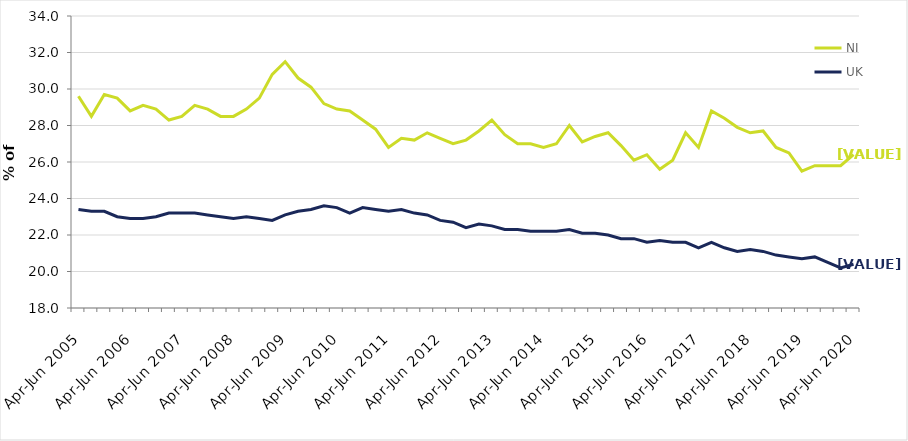
| Category | NI | UK |
|---|---|---|
| Apr-Jun 2005 | 29.6 | 23.4 |
| Jul-Sep 2005 | 28.5 | 23.3 |
| Oct-Dec 2005 | 29.7 | 23.3 |
| Jan-Mar 2006 | 29.5 | 23 |
| Apr-Jun 2006 | 28.8 | 22.9 |
| Jul-Sep 2006 | 29.1 | 22.9 |
| Oct-Dec 2006 | 28.9 | 23 |
| Jan-Mar 2007 | 28.3 | 23.2 |
| Apr-Jun 2007 | 28.5 | 23.2 |
| Jul-Sep 2007 | 29.1 | 23.2 |
| Oct-Dec 2007 | 28.9 | 23.1 |
| Jan-Mar 2008 | 28.5 | 23 |
| Apr-Jun 2008 | 28.5 | 22.9 |
| Jul-Sep 2008 | 28.9 | 23 |
| Oct-Dec 2008 | 29.5 | 22.9 |
| Jan-Mar 2009 | 30.8 | 22.8 |
| Apr-Jun 2009 | 31.5 | 23.1 |
| Jul-Sep 2009 | 30.6 | 23.3 |
| Oct-Dec 2009 | 30.1 | 23.4 |
| Jan-Mar 2010 | 29.2 | 23.6 |
| Apr-Jun 2010 | 28.9 | 23.5 |
| Jul-Sep 2010 | 28.8 | 23.2 |
| Oct-Dec 2010 | 28.3 | 23.5 |
| Jan-Mar 2011 | 27.8 | 23.4 |
| Apr-Jun 2011 | 26.8 | 23.3 |
| Jul-Sep 2011 | 27.3 | 23.4 |
| Oct-Dec 2011 | 27.2 | 23.2 |
| Jan-Mar 2012 | 27.6 | 23.1 |
| Apr-Jun 2012 | 27.3 | 22.8 |
| Jul-Sep 2012 | 27 | 22.7 |
| Oct-Dec 2012 | 27.2 | 22.4 |
| Jan-Mar 2013 | 27.7 | 22.6 |
| Apr-Jun 2013 | 28.3 | 22.5 |
| Jul-Sep 2013 | 27.5 | 22.3 |
| Oct-Dec 2013 | 27 | 22.3 |
| Jan-Mar 2014 | 27 | 22.2 |
| Apr-Jun 2014 | 26.8 | 22.2 |
| Jul-Sep 2014 | 27 | 22.2 |
| Oct-Dec 2014 | 28 | 22.3 |
| Jan-Mar 2015 | 27.1 | 22.1 |
| Apr-Jun 2015 | 27.4 | 22.1 |
| Jul-Sep 2015 | 27.6 | 22 |
| Oct-Dec 2015 | 26.9 | 21.8 |
| Jan-Mar 2016 | 26.1 | 21.8 |
| Apr-Jun 2016 | 26.4 | 21.6 |
| Jul-Sep 2016 | 25.6 | 21.7 |
| Oct-Dec 2016 | 26.1 | 21.6 |
| Jan-Mar 2017 | 27.6 | 21.6 |
| Apr-Jun 2017 | 26.8 | 21.3 |
| Jul-Sep 2017 | 28.8 | 21.6 |
| Oct-Dec 2017 | 28.4 | 21.3 |
| Jan-Mar 2018 | 27.9 | 21.1 |
| Apr-Jun 2018 | 27.6 | 21.2 |
| Jul-Sep 2018 | 27.7 | 21.1 |
| Oct-Dec 2018 | 26.8 | 20.9 |
| Jan-Mar 2019 | 26.5 | 20.8 |
| Apr-Jun 2019 | 25.5 | 20.7 |
| Jul-Sep 2019 | 25.8 | 20.8 |
| Oct-Dec 2019 | 25.8 | 20.5 |
| Jan-Mar 2020 | 25.8 | 20.2 |
| Apr-Jun 2020 | 26.4 | 20.4 |